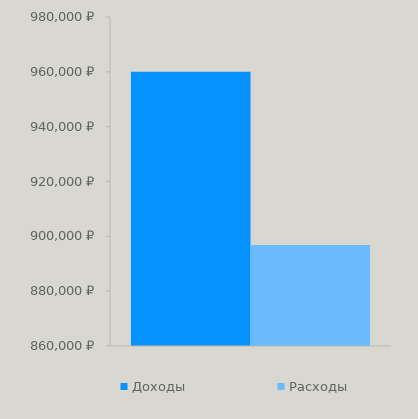
| Category | Доходы | Расходы |
|---|---|---|
| 0 | 960000 | 896873.537 |